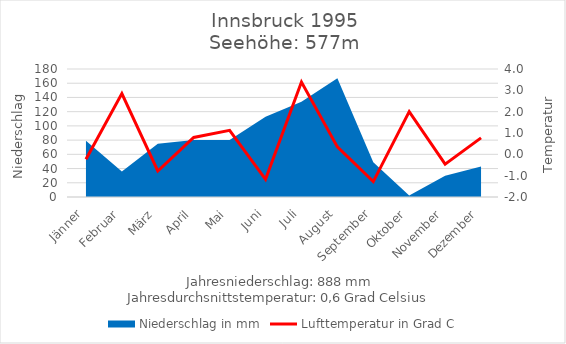
| Category | Lufttemperatur in Grad C |
|---|---|
| Jänner | -0.227 |
| Februar | 2.847 |
| März | -0.78 |
| April | 0.79 |
| Mai | 1.123 |
| Juni | -1.17 |
| Juli | 3.39 |
| August | 0.347 |
| September | -1.277 |
| Oktober | 2 |
| November | -0.463 |
| Dezember | 0.773 |